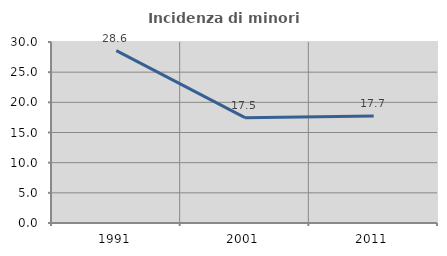
| Category | Incidenza di minori stranieri |
|---|---|
| 1991.0 | 28.571 |
| 2001.0 | 17.46 |
| 2011.0 | 17.742 |